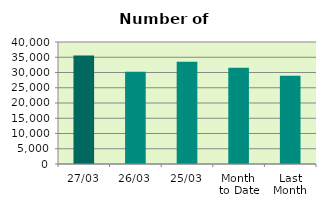
| Category | Series 0 |
|---|---|
| 27/03 | 35554 |
| 26/03 | 30214 |
| 25/03 | 33550 |
| Month 
to Date | 31554 |
| Last
Month | 28915.6 |